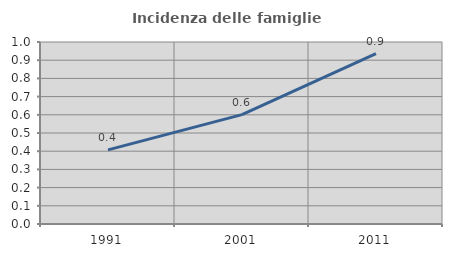
| Category | Incidenza delle famiglie numerose |
|---|---|
| 1991.0 | 0.407 |
| 2001.0 | 0.601 |
| 2011.0 | 0.936 |